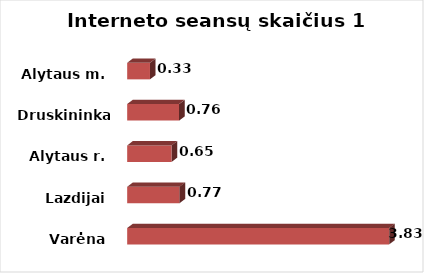
| Category | Series 0 |
|---|---|
| Varėna | 3.827 |
| Lazdijai | 0.766 |
| Alytaus r. | 0.65 |
| Druskininkai  | 0.759 |
| Alytaus m. | 0.333 |